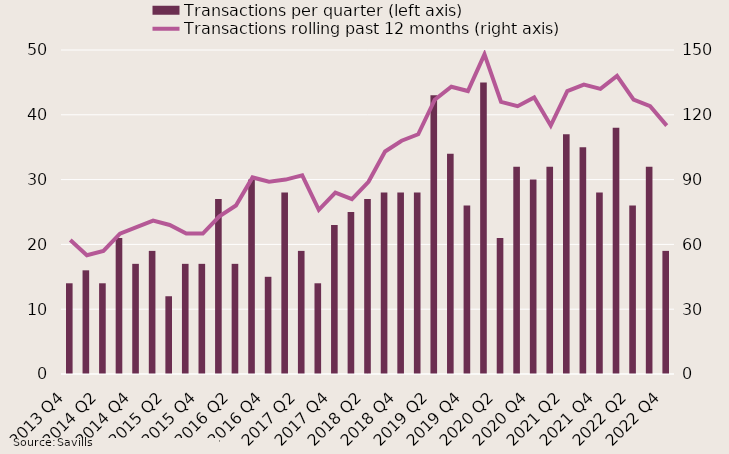
| Category | Transactions per quarter (left axis) |
|---|---|
| 2013 Q4 | 14 |
| 2014 Q1 | 16 |
| 2014 Q2 | 14 |
| 2014 Q3 | 21 |
| 2014 Q4 | 17 |
| 2015 Q1 | 19 |
| 2015 Q2 | 12 |
| 2015 Q3 | 17 |
| 2015 Q4 | 17 |
| 2016 Q1 | 27 |
| 2016 Q2 | 17 |
| 2016 Q3 | 30 |
| 2016 Q4 | 15 |
| 2017 Q1 | 28 |
| 2017 Q2 | 19 |
| 2017 Q3 | 14 |
| 2017 Q4 | 23 |
| 2018 Q1 | 25 |
| 2018 Q2 | 27 |
| 2018 Q3 | 28 |
| 2018 Q4 | 28 |
| 2019 Q1 | 28 |
| 2019 Q2 | 43 |
| 2019 Q3 | 34 |
| 2019 Q4 | 26 |
| 2020 Q1 | 45 |
| 2020 Q2 | 21 |
| 2020 Q3 | 32 |
| 2020 Q4 | 30 |
| 2021 Q1 | 32 |
| 2021 Q2 | 37 |
| 2021 Q3 | 35 |
| 2021 Q4 | 28 |
| 2022 Q1 | 38 |
| 2022 Q2 | 26 |
| 2022 Q3 | 32 |
| 2022 Q4 | 19 |